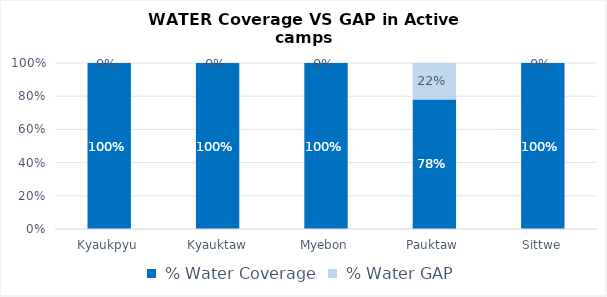
| Category |  % Water Coverage |  % Water GAP |
|---|---|---|
| Kyaukpyu | 1 | 0 |
| Kyauktaw | 1 | 0 |
| Myebon | 1 | 0 |
| Pauktaw | 0.784 | 0.216 |
| Sittwe | 1 | 0 |